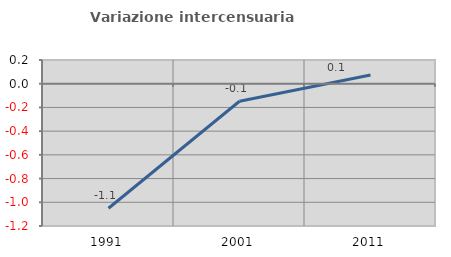
| Category | Variazione intercensuaria annua |
|---|---|
| 1991.0 | -1.05 |
| 2001.0 | -0.148 |
| 2011.0 | 0.074 |